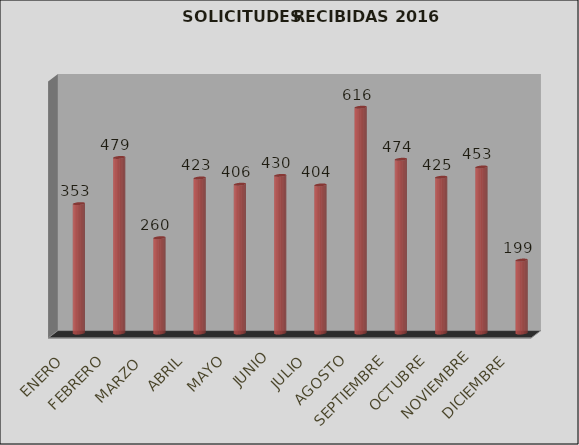
| Category | Series 0 | Series 1 |
|---|---|---|
| ENERO |  | 353 |
| FEBRERO |  | 479 |
| MARZO  |  | 260 |
| ABRIL |  | 423 |
| MAYO |  | 406 |
| JUNIO |  | 430 |
| JULIO |  | 404 |
| AGOSTO |  | 616 |
| SEPTIEMBRE |  | 474 |
| OCTUBRE |  | 425 |
| NOVIEMBRE |  | 453 |
| DICIEMBRE |  | 199 |